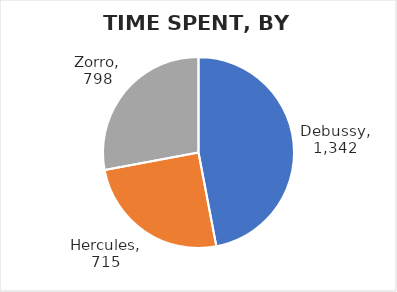
| Category | Total minutes |
|---|---|
| Debussy | 1342 |
| Hercules | 715 |
| Zorro | 798 |